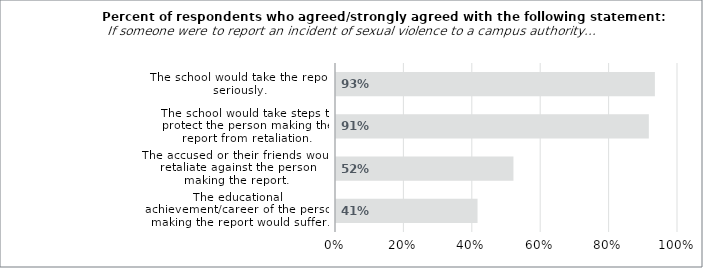
| Category | Series 0 |
|---|---|
| The educational achievement/career of the person making the report would suffer. | 0.414 |
| The accused or their friends would retaliate against the person making the report. | 0.519 |
| The school would take steps to protect the person making the report from retaliation. | 0.915 |
| The school would take the report seriously. | 0.932 |